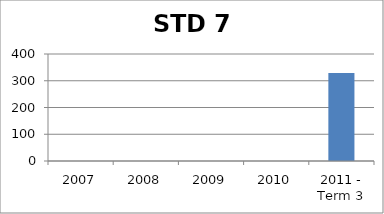
| Category | Score |
|---|---|
| 2007 | 0 |
| 2008 | 0 |
| 2009 | 0 |
| 2010 | 0 |
| 2011 - Term 3 | 329.43 |